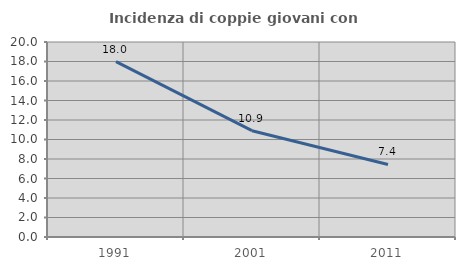
| Category | Incidenza di coppie giovani con figli |
|---|---|
| 1991.0 | 17.99 |
| 2001.0 | 10.904 |
| 2011.0 | 7.443 |